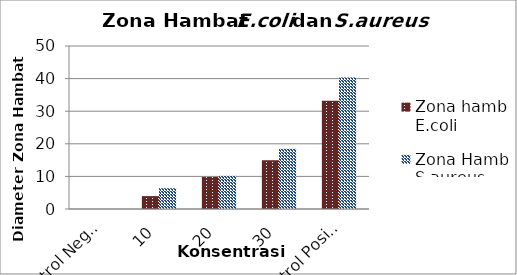
| Category | Zona hambat E.coli | Zona Hambat S.aureus |
|---|---|---|
| Kontrol Negatif | 0 | 0 |
| 10 | 3.958 | 6.375 |
| 20 | 9.833 | 10.167 |
| 30 | 14.958 | 18.5 |
| Kontrol Positif | 33.236 | 40.333 |